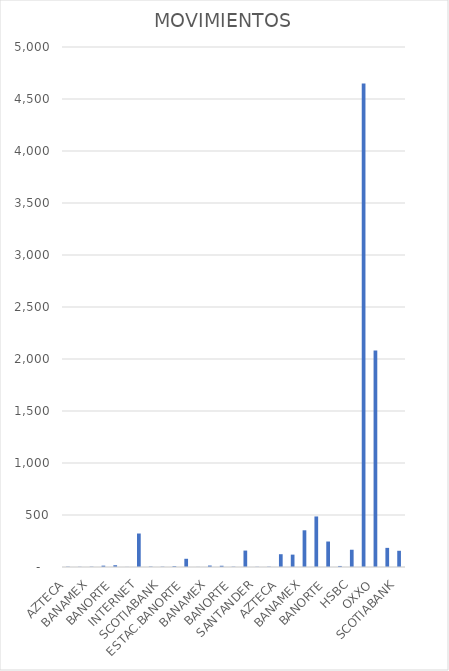
| Category | MOVIMIENTOS |
|---|---|
| AZTECA | 3 |
| BAJIO | 2 |
| BANAMEX | 3 |
| BANCOMER | 13 |
| BANORTE | 17 |
| HSBC | 1 |
| INTERNET | 322 |
| SANTANDER | 4 |
| SCOTIABANK | 3 |
| OXXO | 8 |
| ESTAC.BANORTE | 79 |
| AZTECA | 1 |
| BANAMEX | 14 |
| BANCOMER | 12 |
| BANORTE | 3 |
| INTERNET | 158 |
| SANTANDER | 2 |
| SCOTIABANK | 3 |
| AZTECA | 123 |
| BAJIO | 119 |
| BANAMEX | 353 |
| BANCOMER | 486 |
| BANORTE | 245 |
| BANREGIO | 10 |
| HSBC | 166 |
| INTERNET | 4648 |
| OXXO | 2082 |
| SANTANDER | 184 |
| SCOTIABANK | 156 |